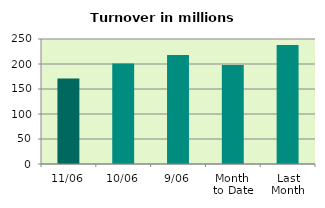
| Category | Series 0 |
|---|---|
| 11/06 | 171.204 |
| 10/06 | 200.857 |
| 9/06 | 217.995 |
| Month 
to Date | 197.964 |
| Last
Month | 237.894 |